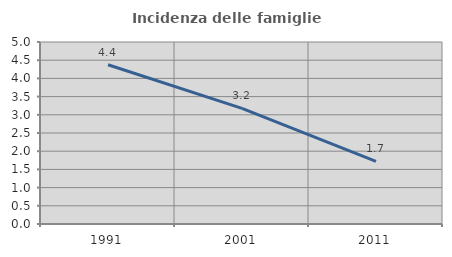
| Category | Incidenza delle famiglie numerose |
|---|---|
| 1991.0 | 4.375 |
| 2001.0 | 3.176 |
| 2011.0 | 1.722 |